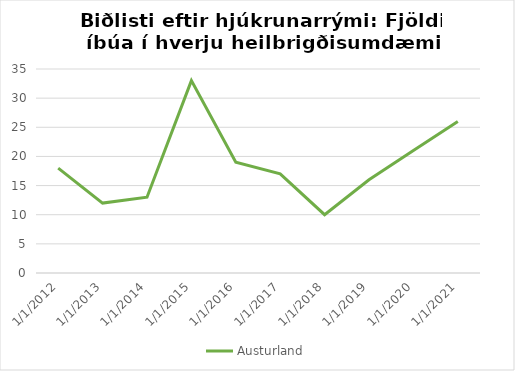
| Category | Austurland |
|---|---|
| 1/1/12 | 18 |
| 1/1/13 | 12 |
| 1/1/14 | 13 |
| 1/1/15 | 33 |
| 1/1/16 | 19 |
| 1/1/17 | 17 |
| 1/1/18 | 10 |
| 1/1/19 | 16 |
| 1/1/20 | 21 |
| 1/1/21 | 26 |